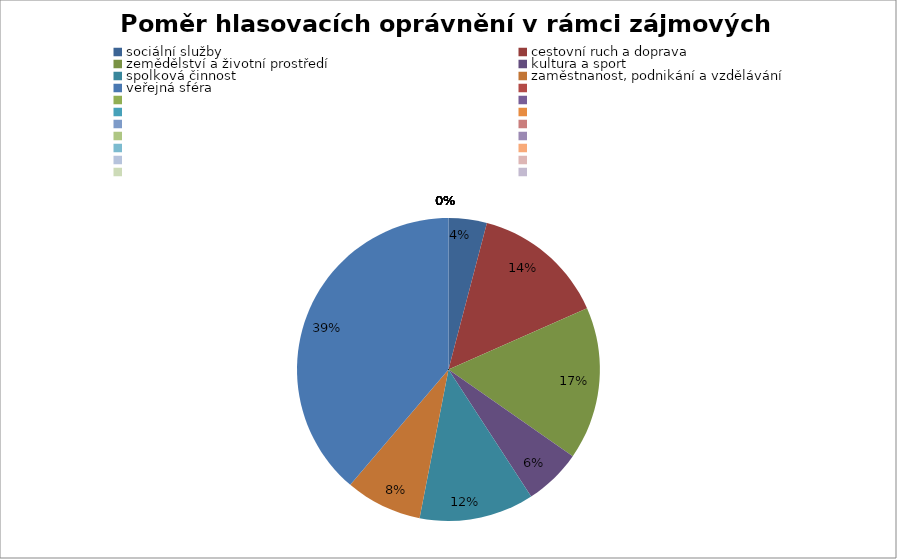
| Category | Series 0 |
|---|---|
| sociální služby | 0.041 |
| cestovní ruch a doprava | 0.143 |
| zemědělství a životní prostředí | 0.163 |
| kultura a sport | 0.061 |
| spolková činnost | 0.122 |
| zaměstnanost, podnikání a vzdělávání | 0.082 |
| veřejná sféra | 0.388 |